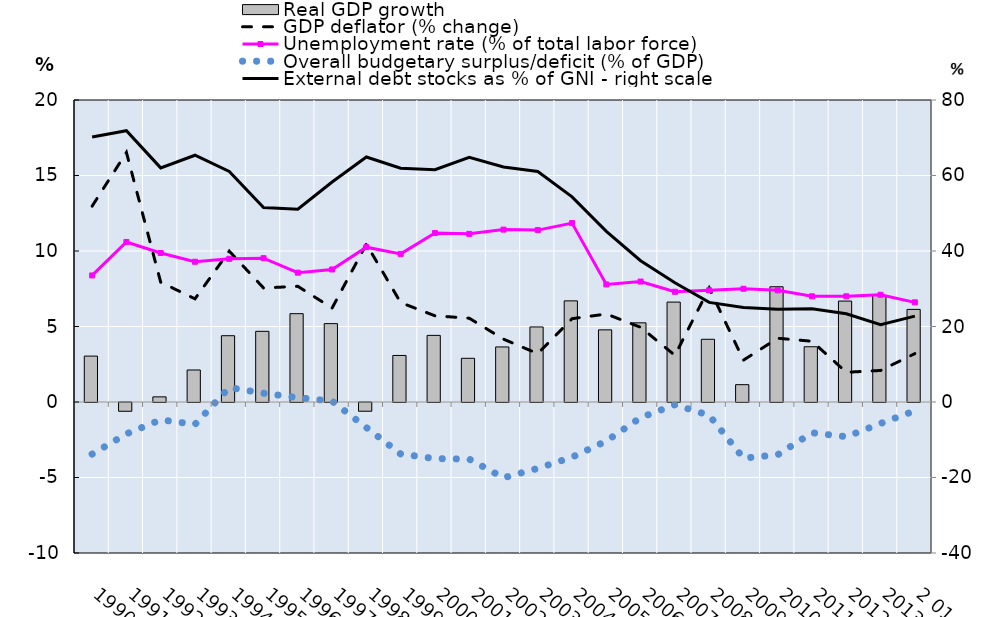
| Category | Real GDP growth |
|---|---|
| 1990 | 3.04 |
| 1991 | -0.58 |
| 1992 | 0.34 |
| 1993 | 2.12 |
| 1994 | 4.39 |
| 1995 | 4.68 |
| 1996 | 5.85 |
| 1997 | 5.19 |
| 1998 | -0.577 |
| 1999 | 3.082 |
| 2000 | 4.411 |
| 2001 | 2.894 |
| 2002 | 3.646 |
| 2003 | 4.97 |
| 2004 | 6.698 |
| 2005 | 4.778 |
| 2006 | 5.243 |
| 2007 | 6.617 |
| 2008 | 4.153 |
| 2009 | 1.148 |
| 2010 | 7.632 |
| 2011 | 3.66 |
| 2012 | 6.684 |
| 2013 | 7.055 |
| 2014 | 6.132 |